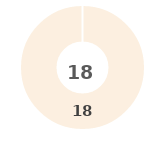
| Category | Series 0 |
|---|---|
| 0 | 0 |
| 1 | 0 |
| 2 | 0 |
| 3 | 0 |
| 4 | 18 |